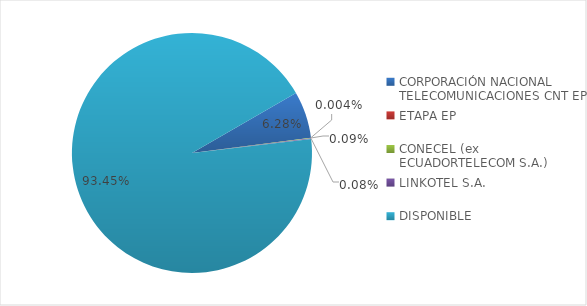
| Category | CÓDIGO DE ÁREA 3 |
|---|---|
| CORPORACIÓN NACIONAL TELECOMUNICACIONES CNT EP | 0.063 |
| ETAPA EP | 0 |
| CONECEL (ex ECUADORTELECOM S.A.) | 0.001 |
| LINKOTEL S.A. | 0.001 |
| DISPONIBLE | 0.934 |